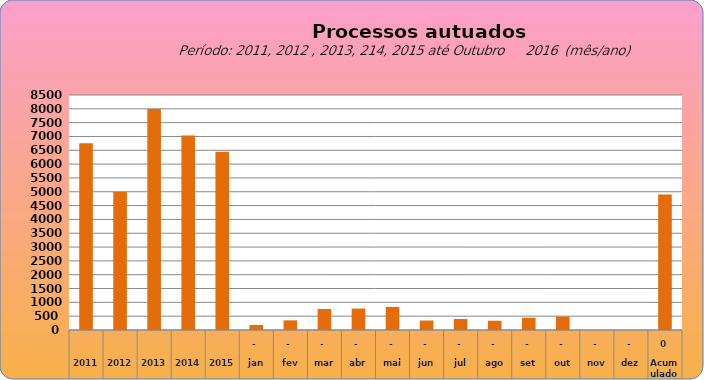
| Category | 6755 |
|---|---|
| 2011 | 6755 |
| 2012 | 4997 |
| 2013 | 7990 |
| 2014 | 7034 |
| 2015 | 6446 |
| jan | 182 |
| fev | 349 |
| mar | 760 |
| abr | 777 |
| mai | 834 |
| jun | 343 |
| jul | 397 |
| ago | 335 |
| set | 441 |
| out | 486 |
| nov | 0 |
| dez | 0 |
| Acumulado
 | 4904 |